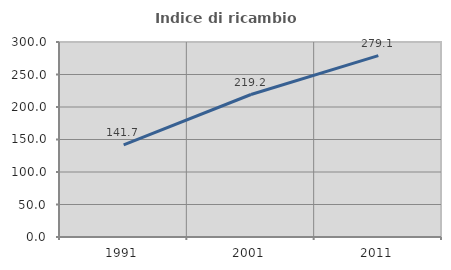
| Category | Indice di ricambio occupazionale  |
|---|---|
| 1991.0 | 141.722 |
| 2001.0 | 219.231 |
| 2011.0 | 279.104 |